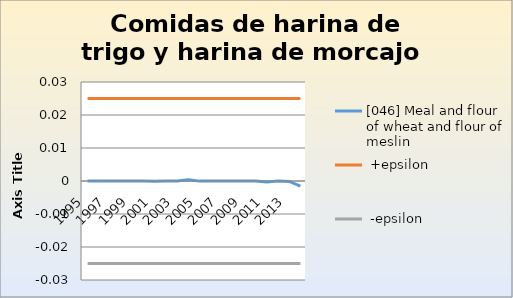
| Category | [046] Meal and flour of wheat and flour of meslin |  +epsilon |  -epsilon |
|---|---|---|---|
| 1995.0 | 0 | 0.025 | -0.025 |
| 1996.0 | 0 | 0.025 | -0.025 |
| 1997.0 | 0 | 0.025 | -0.025 |
| 1998.0 | 0 | 0.025 | -0.025 |
| 1999.0 | 0 | 0.025 | -0.025 |
| 2000.0 | 0 | 0.025 | -0.025 |
| 2001.0 | 0 | 0.025 | -0.025 |
| 2002.0 | 0 | 0.025 | -0.025 |
| 2003.0 | 0 | 0.025 | -0.025 |
| 2004.0 | 0 | 0.025 | -0.025 |
| 2005.0 | 0 | 0.025 | -0.025 |
| 2006.0 | 0 | 0.025 | -0.025 |
| 2007.0 | 0 | 0.025 | -0.025 |
| 2008.0 | 0 | 0.025 | -0.025 |
| 2009.0 | 0 | 0.025 | -0.025 |
| 2010.0 | 0 | 0.025 | -0.025 |
| 2011.0 | 0 | 0.025 | -0.025 |
| 2012.0 | 0 | 0.025 | -0.025 |
| 2013.0 | 0 | 0.025 | -0.025 |
| 2014.0 | -0.002 | 0.025 | -0.025 |